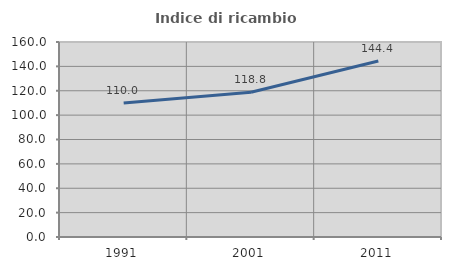
| Category | Indice di ricambio occupazionale  |
|---|---|
| 1991.0 | 110 |
| 2001.0 | 118.75 |
| 2011.0 | 144.444 |